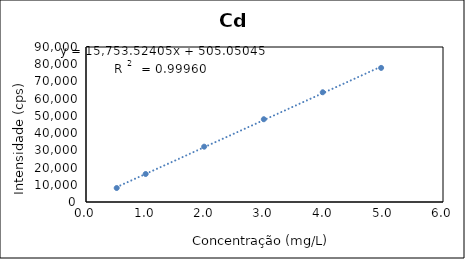
| Category | Series 0 |
|---|---|
| 0.5158962587657339 | 8121.783 |
| 1.0028008814743414 | 16263.393 |
| 1.9860390224227333 | 32118.193 |
| 2.9886726578826948 | 48059.093 |
| 3.9789919756898127 | 63722.293 |
| 4.960244164246264 | 77864.093 |